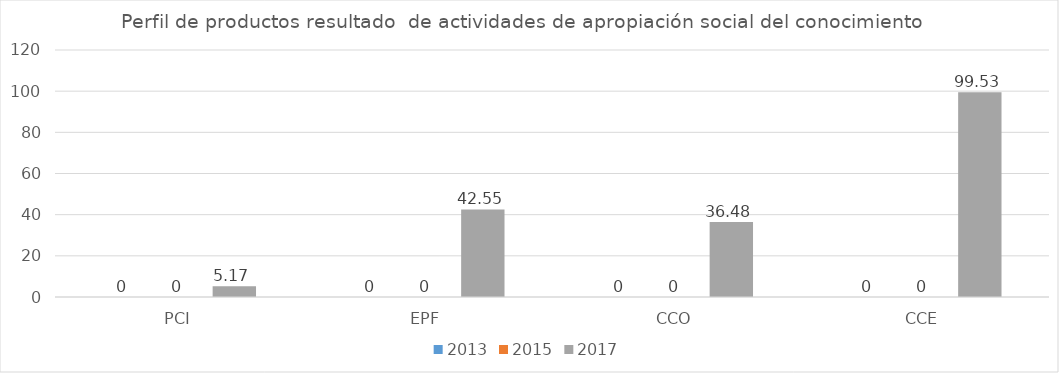
| Category | 2013 | 2015 | 2017 |
|---|---|---|---|
| PCI | 0 | 0 | 5.17 |
| EPF | 0 | 0 | 42.55 |
| CCO | 0 | 0 | 36.48 |
| CCE | 0 | 0 | 99.53 |